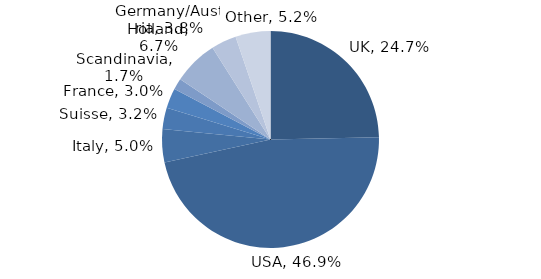
| Category | Investment Style |
|---|---|
| UK | 0.247 |
| USA | 0.469 |
| Italy | 0.05 |
| Suisse | 0.032 |
| France | 0.03 |
| Scandinavia | 0.017 |
| Holland | 0.067 |
| Germany/Austria | 0.038 |
| Other | 0.052 |